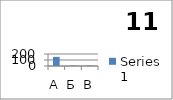
| Category | Series 0 |
|---|---|
| А | 152 |
| Б | 6 |
| В | 6 |